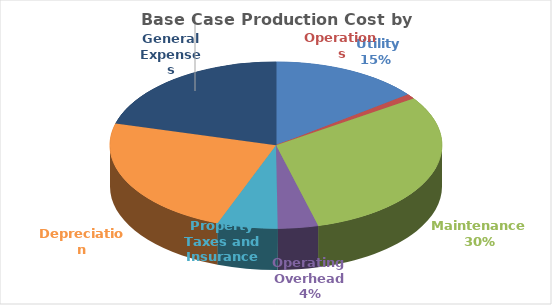
| Category | Series 0 |
|---|---|
|  Utility  | 5.774 |
| Operations | 0.371 |
| Maintenance  | 12.03 |
| Operating Overhead  | 1.549 |
| Property Taxes and Insurance | 2.325 |
| Depreciation | 9.299 |
| General Expenses | 8.23 |